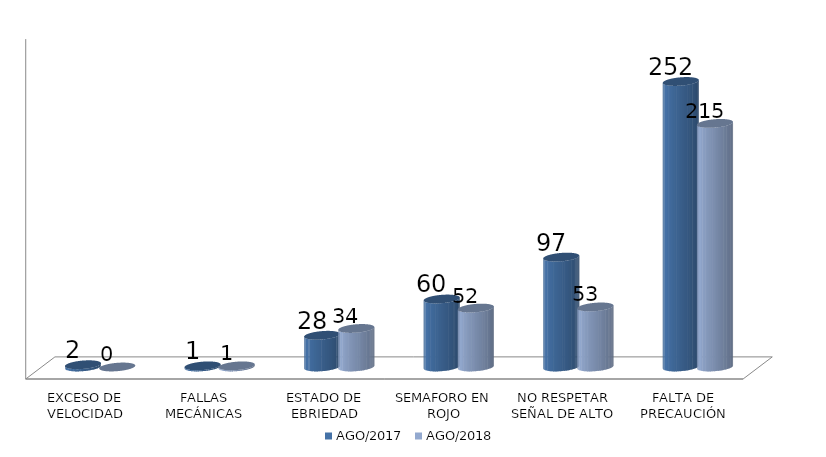
| Category | AGO/2017 | AGO/2018 |
|---|---|---|
| EXCESO DE VELOCIDAD | 2 | 0 |
| FALLAS MECÁNICAS | 1 | 1 |
| ESTADO DE EBRIEDAD | 28 | 34 |
| SEMAFORO EN ROJO | 60 | 52 |
| NO RESPETAR SEÑAL DE ALTO | 97 | 53 |
| FALTA DE PRECAUCIÓN | 252 | 215 |